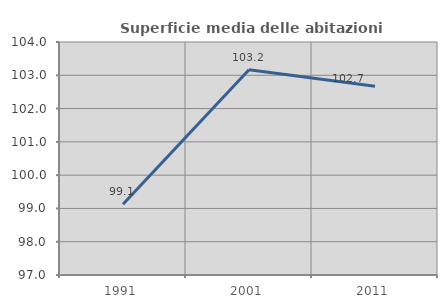
| Category | Superficie media delle abitazioni occupate |
|---|---|
| 1991.0 | 99.123 |
| 2001.0 | 103.165 |
| 2011.0 | 102.673 |